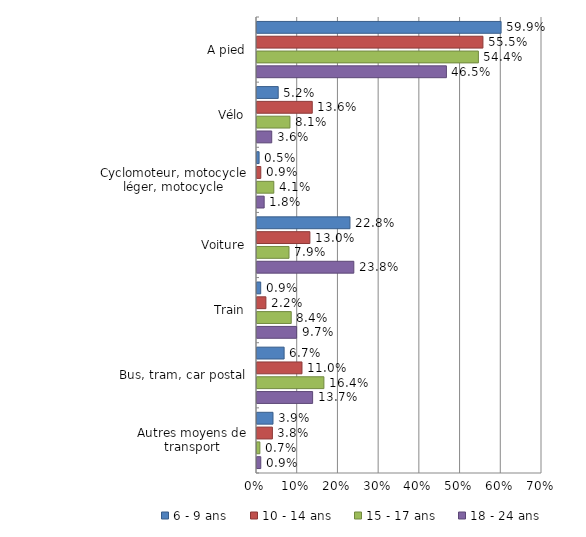
| Category | 6 - 9 ans | 10 - 14 ans | 15 - 17 ans | 18 - 24 ans |
|---|---|---|---|---|
| A pied | 59.949 | 55.491 | 54.377 | 46.523 |
| Vélo | 5.208 | 13.57 | 8.091 | 3.617 |
| Cyclomoteur, motocycle léger, motocycle | 0.515 | 0.932 | 4.129 | 1.761 |
| Voiture | 22.833 | 12.99 | 7.86 | 23.78 |
| Train | 0.907 | 2.186 | 8.407 | 9.731 |
| Bus, tram, car postal | 6.661 | 11.049 | 16.431 | 13.661 |
| Autres moyens de transport | 3.927 | 3.783 | 0.705 | 0.927 |